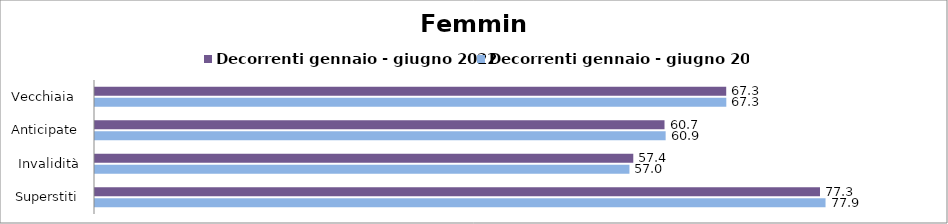
| Category | Decorrenti gennaio - giugno 2022 | Decorrenti gennaio - giugno 2023 |
|---|---|---|
| Vecchiaia  | 67.31 | 67.32 |
| Anticipate | 60.73 | 60.85 |
| Invalidità | 57.4 | 56.99 |
| Superstiti | 77.31 | 77.9 |